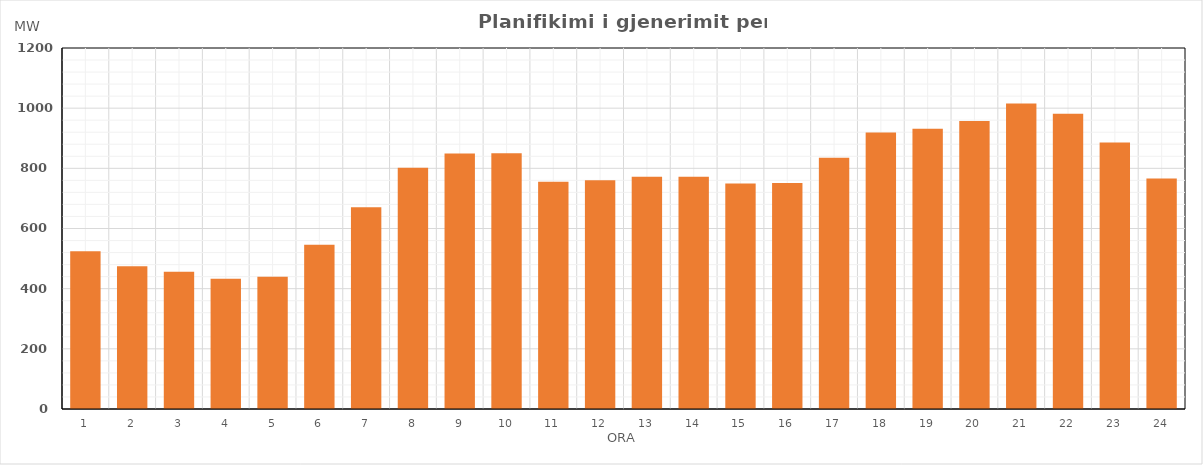
| Category | Max (MW) |
|---|---|
| 0 | 524.48 |
| 1 | 474.74 |
| 2 | 456.04 |
| 3 | 432.74 |
| 4 | 439.44 |
| 5 | 545.81 |
| 6 | 670.36 |
| 7 | 802.03 |
| 8 | 849.48 |
| 9 | 849.85 |
| 10 | 755.4 |
| 11 | 760.43 |
| 12 | 772.15 |
| 13 | 772.15 |
| 14 | 749.86 |
| 15 | 751.32 |
| 16 | 835.05 |
| 17 | 919.45 |
| 18 | 931.46 |
| 19 | 956.98 |
| 20 | 1015.45 |
| 21 | 981.68 |
| 22 | 885.89 |
| 23 | 766.59 |